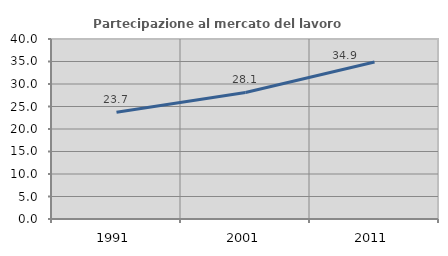
| Category | Partecipazione al mercato del lavoro  femminile |
|---|---|
| 1991.0 | 23.72 |
| 2001.0 | 28.121 |
| 2011.0 | 34.887 |